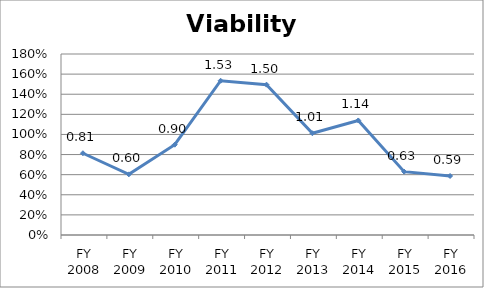
| Category | Viability ratio |
|---|---|
| FY 2016 | 0.587 |
| FY 2015 | 0.63 |
| FY 2014 | 1.139 |
| FY 2013 | 1.012 |
| FY 2012 | 1.495 |
| FY 2011 | 1.534 |
| FY 2010 | 0.898 |
| FY 2009 | 0.603 |
| FY 2008 | 0.813 |